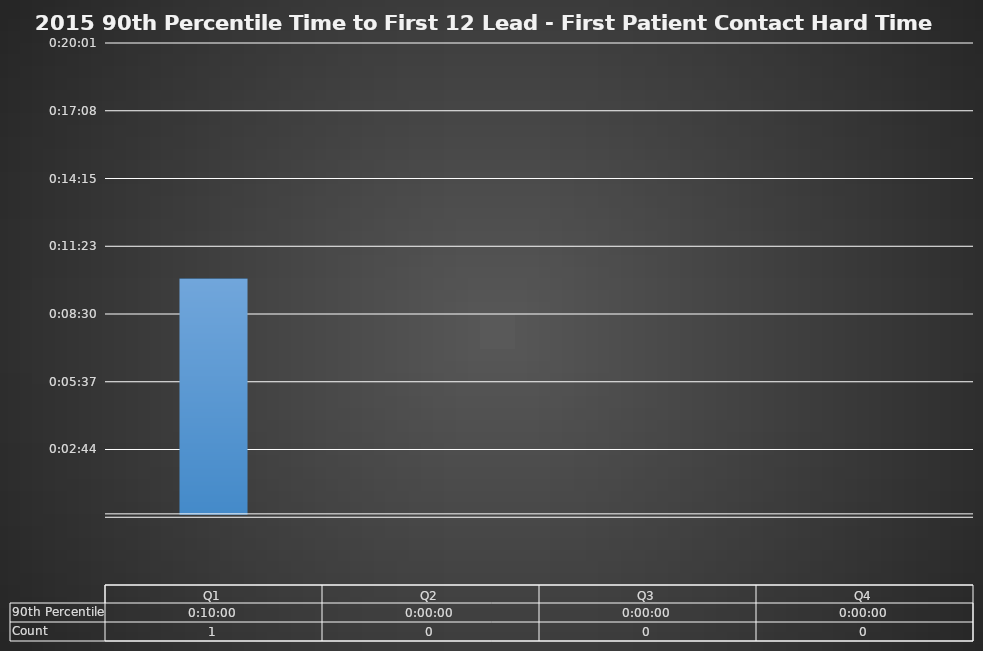
| Category | 90th Percentile |
|---|---|
| Q1 | 0.007 |
| Q2 | 0 |
| Q3 | 0 |
| Q4 | 0 |